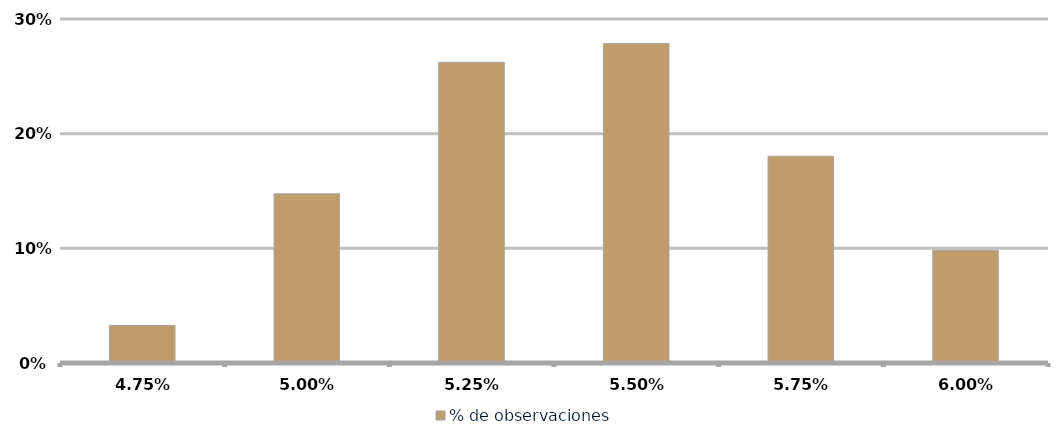
| Category | % de observaciones  |
|---|---|
| 0.047499999999999994 | 0.033 |
| 0.049999999999999996 | 0.148 |
| 0.0525 | 0.262 |
| 0.055 | 0.279 |
| 0.0575 | 0.18 |
| 0.060000000000000005 | 0.098 |